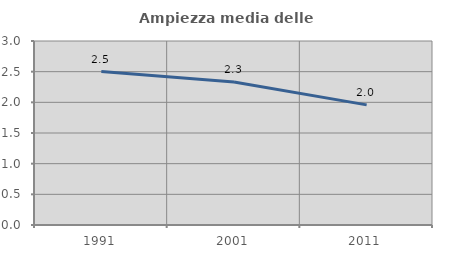
| Category | Ampiezza media delle famiglie |
|---|---|
| 1991.0 | 2.501 |
| 2001.0 | 2.331 |
| 2011.0 | 1.959 |